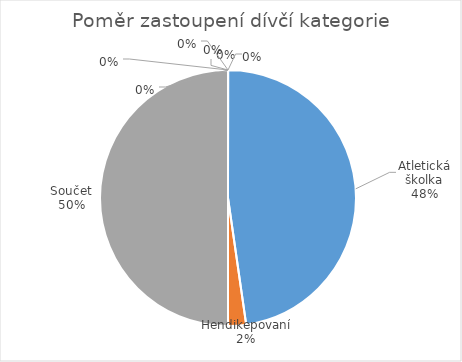
| Category | Series 0 |
|---|---|
| Atletická školka | 21 |
| Hendikepovaní | 1 |
| Součet | 22 |